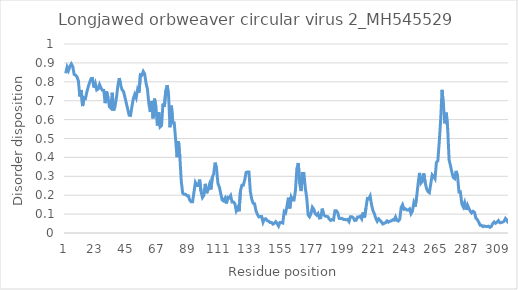
| Category | Series 0 |
|---|---|
| 0 | 0.845 |
| 1 | 0.878 |
| 2 | 0.86 |
| 3 | 0.881 |
| 4 | 0.895 |
| 5 | 0.881 |
| 6 | 0.839 |
| 7 | 0.835 |
| 8 | 0.826 |
| 9 | 0.805 |
| 10 | 0.722 |
| 11 | 0.757 |
| 12 | 0.672 |
| 13 | 0.715 |
| 14 | 0.711 |
| 15 | 0.745 |
| 16 | 0.774 |
| 17 | 0.798 |
| 18 | 0.817 |
| 19 | 0.818 |
| 20 | 0.77 |
| 21 | 0.792 |
| 22 | 0.757 |
| 23 | 0.762 |
| 24 | 0.786 |
| 25 | 0.768 |
| 26 | 0.755 |
| 27 | 0.755 |
| 28 | 0.687 |
| 29 | 0.749 |
| 30 | 0.717 |
| 31 | 0.668 |
| 32 | 0.661 |
| 33 | 0.742 |
| 34 | 0.648 |
| 35 | 0.671 |
| 36 | 0.715 |
| 37 | 0.778 |
| 38 | 0.82 |
| 39 | 0.783 |
| 40 | 0.757 |
| 41 | 0.749 |
| 42 | 0.719 |
| 43 | 0.687 |
| 44 | 0.655 |
| 45 | 0.623 |
| 46 | 0.622 |
| 47 | 0.669 |
| 48 | 0.712 |
| 49 | 0.734 |
| 50 | 0.715 |
| 51 | 0.759 |
| 52 | 0.742 |
| 53 | 0.838 |
| 54 | 0.835 |
| 55 | 0.855 |
| 56 | 0.842 |
| 57 | 0.792 |
| 58 | 0.761 |
| 59 | 0.684 |
| 60 | 0.64 |
| 61 | 0.698 |
| 62 | 0.607 |
| 63 | 0.711 |
| 64 | 0.668 |
| 65 | 0.569 |
| 66 | 0.639 |
| 67 | 0.561 |
| 68 | 0.568 |
| 69 | 0.685 |
| 70 | 0.667 |
| 71 | 0.752 |
| 72 | 0.782 |
| 73 | 0.726 |
| 74 | 0.559 |
| 75 | 0.674 |
| 76 | 0.582 |
| 77 | 0.582 |
| 78 | 0.493 |
| 79 | 0.401 |
| 80 | 0.486 |
| 81 | 0.401 |
| 82 | 0.272 |
| 83 | 0.211 |
| 84 | 0.204 |
| 85 | 0.204 |
| 86 | 0.197 |
| 87 | 0.197 |
| 88 | 0.174 |
| 89 | 0.165 |
| 90 | 0.165 |
| 91 | 0.216 |
| 92 | 0.267 |
| 93 | 0.251 |
| 94 | 0.251 |
| 95 | 0.282 |
| 96 | 0.22 |
| 97 | 0.188 |
| 98 | 0.199 |
| 99 | 0.26 |
| 100 | 0.211 |
| 101 | 0.23 |
| 102 | 0.257 |
| 103 | 0.231 |
| 104 | 0.295 |
| 105 | 0.313 |
| 106 | 0.372 |
| 107 | 0.342 |
| 108 | 0.263 |
| 109 | 0.243 |
| 110 | 0.208 |
| 111 | 0.175 |
| 112 | 0.17 |
| 113 | 0.184 |
| 114 | 0.156 |
| 115 | 0.189 |
| 116 | 0.185 |
| 117 | 0.198 |
| 118 | 0.164 |
| 119 | 0.164 |
| 120 | 0.156 |
| 121 | 0.118 |
| 122 | 0.134 |
| 123 | 0.115 |
| 124 | 0.224 |
| 125 | 0.253 |
| 126 | 0.253 |
| 127 | 0.281 |
| 128 | 0.32 |
| 129 | 0.323 |
| 130 | 0.323 |
| 131 | 0.218 |
| 132 | 0.178 |
| 133 | 0.157 |
| 134 | 0.155 |
| 135 | 0.117 |
| 136 | 0.099 |
| 137 | 0.085 |
| 138 | 0.087 |
| 139 | 0.088 |
| 140 | 0.057 |
| 141 | 0.075 |
| 142 | 0.075 |
| 143 | 0.065 |
| 144 | 0.063 |
| 145 | 0.056 |
| 146 | 0.056 |
| 147 | 0.047 |
| 148 | 0.052 |
| 149 | 0.06 |
| 150 | 0.05 |
| 151 | 0.037 |
| 152 | 0.056 |
| 153 | 0.056 |
| 154 | 0.053 |
| 155 | 0.113 |
| 156 | 0.106 |
| 157 | 0.142 |
| 158 | 0.187 |
| 159 | 0.13 |
| 160 | 0.19 |
| 161 | 0.175 |
| 162 | 0.175 |
| 163 | 0.226 |
| 164 | 0.339 |
| 165 | 0.371 |
| 166 | 0.263 |
| 167 | 0.222 |
| 168 | 0.315 |
| 169 | 0.315 |
| 170 | 0.237 |
| 171 | 0.187 |
| 172 | 0.095 |
| 173 | 0.086 |
| 174 | 0.102 |
| 175 | 0.136 |
| 176 | 0.126 |
| 177 | 0.102 |
| 178 | 0.095 |
| 179 | 0.103 |
| 180 | 0.079 |
| 181 | 0.081 |
| 182 | 0.129 |
| 183 | 0.097 |
| 184 | 0.089 |
| 185 | 0.088 |
| 186 | 0.086 |
| 187 | 0.074 |
| 188 | 0.066 |
| 189 | 0.071 |
| 190 | 0.069 |
| 191 | 0.117 |
| 192 | 0.117 |
| 193 | 0.107 |
| 194 | 0.077 |
| 195 | 0.077 |
| 196 | 0.078 |
| 197 | 0.072 |
| 198 | 0.072 |
| 199 | 0.07 |
| 200 | 0.072 |
| 201 | 0.061 |
| 202 | 0.086 |
| 203 | 0.086 |
| 204 | 0.081 |
| 205 | 0.066 |
| 206 | 0.067 |
| 207 | 0.084 |
| 208 | 0.084 |
| 209 | 0.089 |
| 210 | 0.075 |
| 211 | 0.109 |
| 212 | 0.082 |
| 213 | 0.132 |
| 214 | 0.182 |
| 215 | 0.18 |
| 216 | 0.195 |
| 217 | 0.149 |
| 218 | 0.118 |
| 219 | 0.102 |
| 220 | 0.077 |
| 221 | 0.062 |
| 222 | 0.075 |
| 223 | 0.067 |
| 224 | 0.058 |
| 225 | 0.048 |
| 226 | 0.051 |
| 227 | 0.055 |
| 228 | 0.064 |
| 229 | 0.057 |
| 230 | 0.062 |
| 231 | 0.064 |
| 232 | 0.07 |
| 233 | 0.068 |
| 234 | 0.085 |
| 235 | 0.066 |
| 236 | 0.063 |
| 237 | 0.073 |
| 238 | 0.136 |
| 239 | 0.15 |
| 240 | 0.125 |
| 241 | 0.128 |
| 242 | 0.122 |
| 243 | 0.121 |
| 244 | 0.127 |
| 245 | 0.102 |
| 246 | 0.116 |
| 247 | 0.16 |
| 248 | 0.14 |
| 249 | 0.193 |
| 250 | 0.26 |
| 251 | 0.318 |
| 252 | 0.264 |
| 253 | 0.274 |
| 254 | 0.315 |
| 255 | 0.268 |
| 256 | 0.235 |
| 257 | 0.219 |
| 258 | 0.213 |
| 259 | 0.26 |
| 260 | 0.308 |
| 261 | 0.299 |
| 262 | 0.287 |
| 263 | 0.373 |
| 264 | 0.382 |
| 265 | 0.48 |
| 266 | 0.596 |
| 267 | 0.757 |
| 268 | 0.673 |
| 269 | 0.58 |
| 270 | 0.637 |
| 271 | 0.552 |
| 272 | 0.387 |
| 273 | 0.356 |
| 274 | 0.321 |
| 275 | 0.294 |
| 276 | 0.288 |
| 277 | 0.328 |
| 278 | 0.299 |
| 279 | 0.218 |
| 280 | 0.218 |
| 281 | 0.155 |
| 282 | 0.139 |
| 283 | 0.161 |
| 284 | 0.123 |
| 285 | 0.149 |
| 286 | 0.131 |
| 287 | 0.116 |
| 288 | 0.106 |
| 289 | 0.115 |
| 290 | 0.11 |
| 291 | 0.079 |
| 292 | 0.071 |
| 293 | 0.058 |
| 294 | 0.041 |
| 295 | 0.041 |
| 296 | 0.034 |
| 297 | 0.037 |
| 298 | 0.034 |
| 299 | 0.035 |
| 300 | 0.036 |
| 301 | 0.03 |
| 302 | 0.035 |
| 303 | 0.051 |
| 304 | 0.059 |
| 305 | 0.052 |
| 306 | 0.057 |
| 307 | 0.066 |
| 308 | 0.054 |
| 309 | 0.055 |
| 310 | 0.058 |
| 311 | 0.062 |
| 312 | 0.077 |
| 313 | 0.068 |
| 314 | 0.051 |